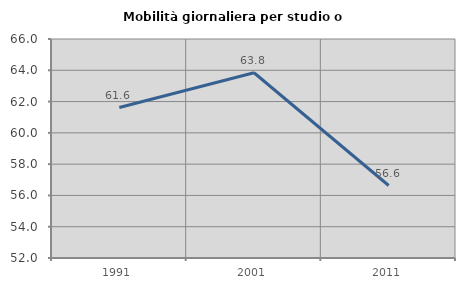
| Category | Mobilità giornaliera per studio o lavoro |
|---|---|
| 1991.0 | 61.616 |
| 2001.0 | 63.844 |
| 2011.0 | 56.634 |